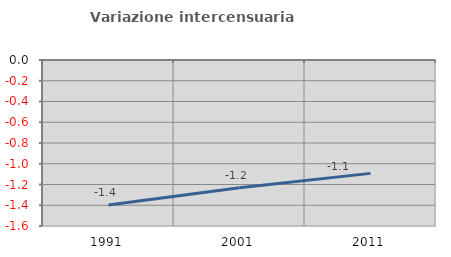
| Category | Variazione intercensuaria annua |
|---|---|
| 1991.0 | -1.398 |
| 2001.0 | -1.232 |
| 2011.0 | -1.093 |